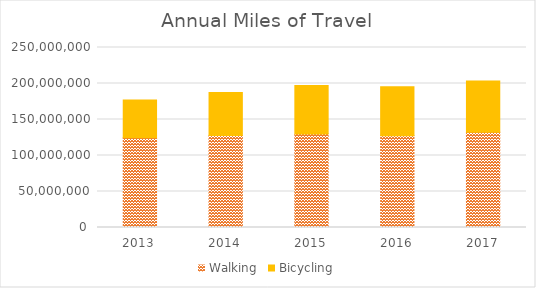
| Category | Walking | Bicycling |
|---|---|---|
| 2013 | 124632805.417 | 52305555.482 |
| 2014 | 127791553.06 | 59756024.226 |
| 2015 | 129711853.297 | 67443816.441 |
| 2016 | 127300052.732 | 68309305.062 |
| 2017 | 132261441.368 | 71154183.239 |